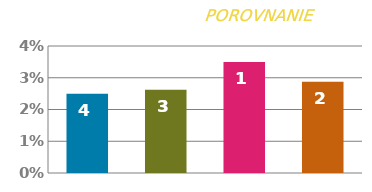
| Category | SADZBA |
|---|---|
| 0 | 0.025 |
| 1 | 0.026 |
| 2 | 0.035 |
| 3 | 0.029 |